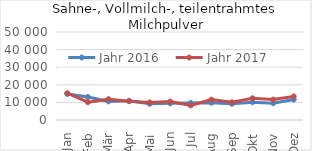
| Category | Jahr 2016 | Jahr 2017 |
|---|---|---|
| Jan | 14794.94 | 15257.541 |
| Feb | 13015.92 | 10141.027 |
| Mär | 10574.89 | 11824.917 |
| Apr | 10898.548 | 10683.469 |
| Mai | 9227.487 | 9995.242 |
| Jun | 9467.189 | 10469.942 |
| Jul | 9652.319 | 8285.724 |
| Aug | 9856.068 | 11583.266 |
| Sep | 9194.872 | 10039.196 |
| Okt | 10132.164 | 12308.739 |
| Nov | 9579.778 | 11590.282 |
| Dez | 11635.299 | 13386.405 |